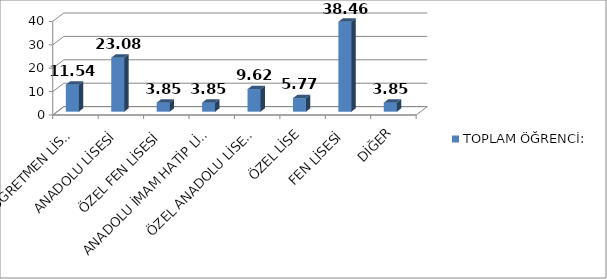
| Category | TOPLAM ÖĞRENCİ: | 100 |
|---|---|---|
| ANADOLU ÖĞRETMEN LİSESİ | 11.54 |  |
| ANADOLU LİSESİ | 23.08 |  |
| ÖZEL FEN LİSESİ | 3.85 |  |
| ANADOLU İMAM HATİP LİSESİ | 3.85 |  |
| ÖZEL ANADOLU LİSESİ | 9.62 |  |
| ÖZEL LİSE | 5.77 |  |
| FEN LİSESİ | 38.46 |  |
| DİĞER | 3.85 |  |